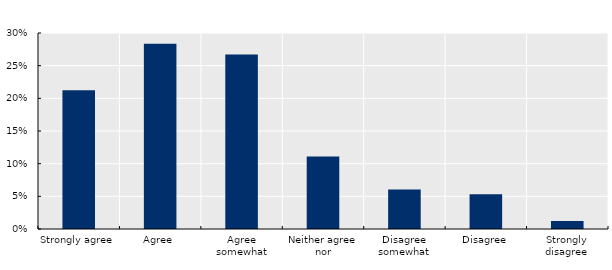
| Category | Series 0 |
|---|---|
| Strongly agree | 0.213 |
| Agree | 0.284 |
| Agree somewhat | 0.267 |
| Neither agree nor | 0.111 |
| Disagree somewhat | 0.06 |
| Disagree | 0.053 |
| Strongly disagree | 0.012 |